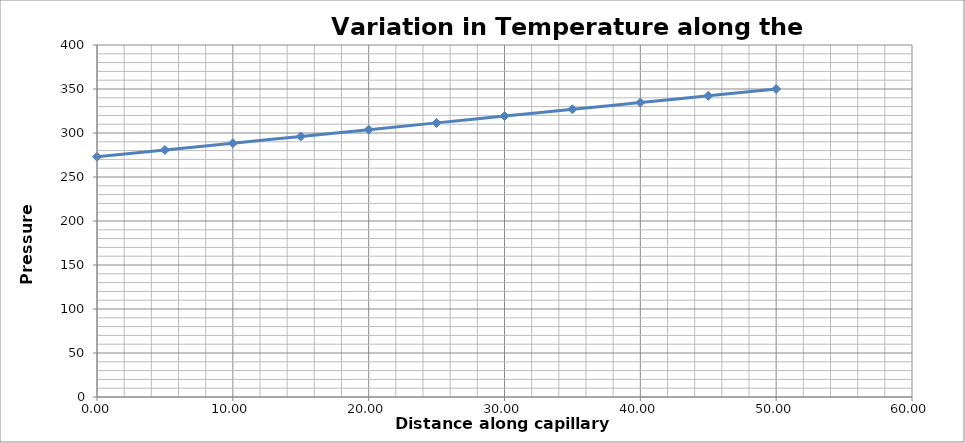
| Category | Series 0 |
|---|---|
| 0.0 | 273 |
| 5.0 | 280.7 |
| 10.0 | 288.4 |
| 15.0 | 296.1 |
| 20.0 | 303.8 |
| 25.0 | 311.5 |
| 30.0 | 319.2 |
| 35.0 | 326.9 |
| 40.0 | 334.6 |
| 45.0 | 342.3 |
| 50.0 | 350 |